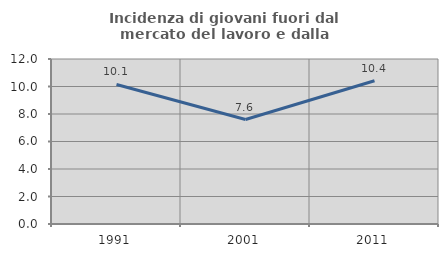
| Category | Incidenza di giovani fuori dal mercato del lavoro e dalla formazione  |
|---|---|
| 1991.0 | 10.148 |
| 2001.0 | 7.6 |
| 2011.0 | 10.421 |